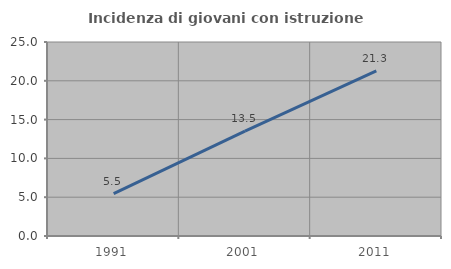
| Category | Incidenza di giovani con istruzione universitaria |
|---|---|
| 1991.0 | 5.471 |
| 2001.0 | 13.505 |
| 2011.0 | 21.29 |